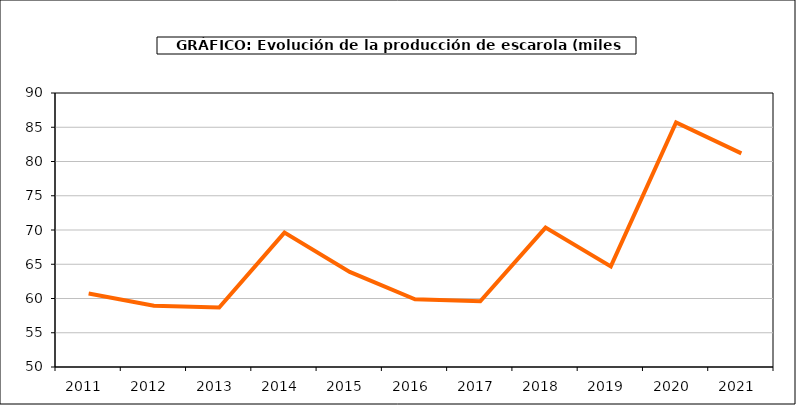
| Category | producción |
|---|---|
| 2011.0 | 60.737 |
| 2012.0 | 58.957 |
| 2013.0 | 58.687 |
| 2014.0 | 69.619 |
| 2015.0 | 63.882 |
| 2016.0 | 59.873 |
| 2017.0 | 59.587 |
| 2018.0 | 70.347 |
| 2019.0 | 64.693 |
| 2020.0 | 85.687 |
| 2021.0 | 81.183 |